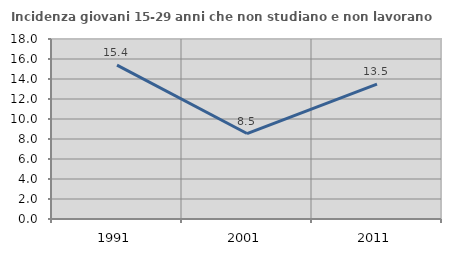
| Category | Incidenza giovani 15-29 anni che non studiano e non lavorano  |
|---|---|
| 1991.0 | 15.388 |
| 2001.0 | 8.547 |
| 2011.0 | 13.478 |